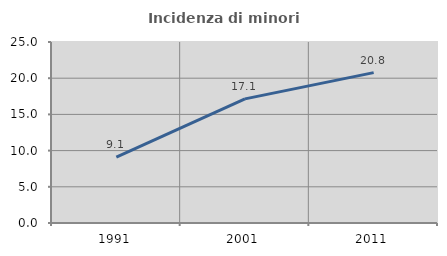
| Category | Incidenza di minori stranieri |
|---|---|
| 1991.0 | 9.091 |
| 2001.0 | 17.143 |
| 2011.0 | 20.769 |